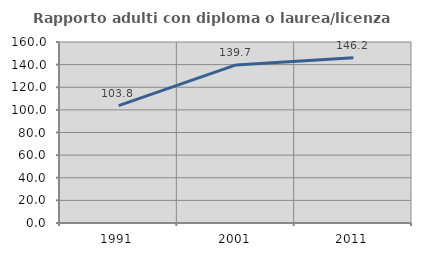
| Category | Rapporto adulti con diploma o laurea/licenza media  |
|---|---|
| 1991.0 | 103.788 |
| 2001.0 | 139.744 |
| 2011.0 | 146.154 |